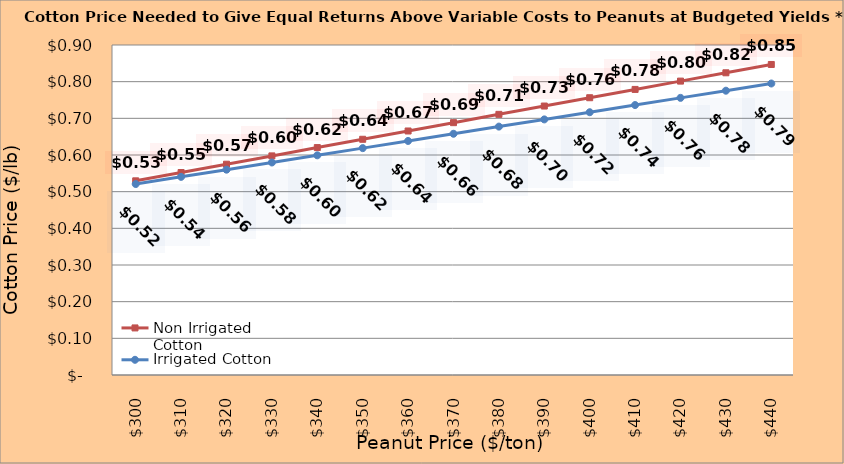
| Category | Non Irrigated Cotton | Irrigated Cotton |
|---|---|---|
| 299.8936170212766 | 0.53 | 0.521 |
| 309.8936170212766 | 0.552 | 0.54 |
| 319.8936170212766 | 0.575 | 0.56 |
| 329.8936170212766 | 0.598 | 0.58 |
| 339.8936170212766 | 0.62 | 0.599 |
| 349.8936170212766 | 0.643 | 0.619 |
| 359.8936170212766 | 0.666 | 0.638 |
| 369.8936170212766 | 0.688 | 0.658 |
| 379.8936170212766 | 0.711 | 0.677 |
| 389.8936170212766 | 0.734 | 0.697 |
| 399.8936170212766 | 0.756 | 0.717 |
| 409.8936170212766 | 0.779 | 0.736 |
| 419.8936170212766 | 0.802 | 0.756 |
| 429.8936170212766 | 0.824 | 0.775 |
| 439.8936170212766 | 0.847 | 0.795 |